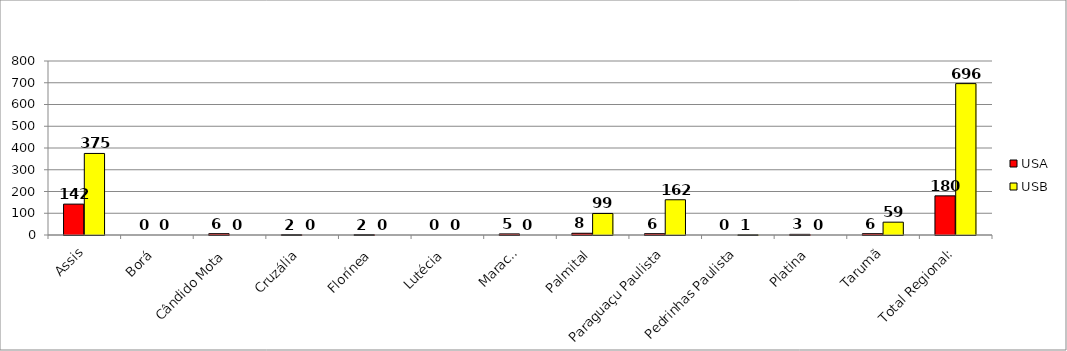
| Category | USA | USB |
|---|---|---|
| Assis | 142 | 375 |
| Borá | 0 | 0 |
| Cândido Mota | 6 | 0 |
| Cruzália | 2 | 0 |
| Florínea | 2 | 0 |
| Lutécia | 0 | 0 |
| Maracaí | 5 | 0 |
| Palmital | 8 | 99 |
| Paraguaçu Paulista | 6 | 162 |
| Pedrinhas Paulista | 0 | 1 |
| Platina | 3 | 0 |
| Tarumã | 6 | 59 |
| Total Regional: | 180 | 696 |